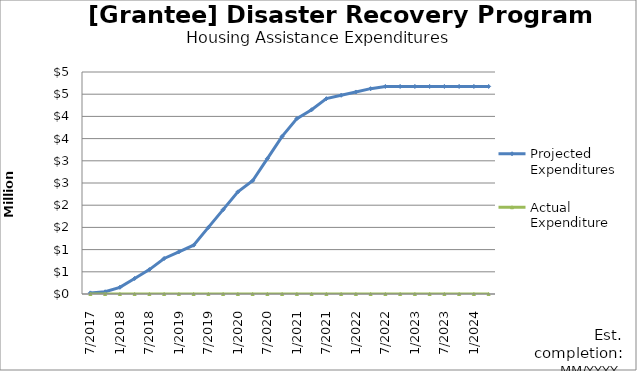
| Category | Projected Expenditures | Actual Expenditure |
|---|---|---|
| 7/2017 | 25000 | 0 |
| 10/2017 | 50001 | 0 |
| 1/2018 | 150001 | 0 |
| 4/2018 | 350001 | 0 |
| 7/2018 | 550001 | 0 |
| 10/2018 | 800001 | 0 |
| 1/2019 | 950001 | 0 |
| 4/2019 | 1100001 | 0 |
| 7/2019 | 1500001 | 0 |
| 10/2019 | 1900001 | 0 |
| 1/2020 | 2300001 | 0 |
| 4/2020 | 2550001 | 0 |
| 7/2020 | 3050001 | 0 |
| 10/2020 | 3550001 | 0 |
| 1/2021 | 3950001 | 0 |
| 4/2021 | 4150001 | 0 |
| 7/2021 | 4400001 | 0 |
| 10/2021 | 4475001 | 0 |
| 1/2022 | 4550001 | 0 |
| 4/2022 | 4625001 | 0 |
| 7/2022 | 4675001 | 0 |
| 10/2022 | 4675001 | 0 |
| 1/2023 | 4675001 | 0 |
| 4/2023 | 4675001 | 0 |
| 7/2023 | 4675001 | 0 |
| 10/2023 | 4675001 | 0 |
| 1/2024 | 4675001 | 0 |
| 4/2024 | 4675001 | 0 |